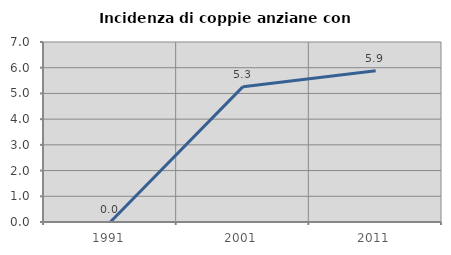
| Category | Incidenza di coppie anziane con figli |
|---|---|
| 1991.0 | 0 |
| 2001.0 | 5.263 |
| 2011.0 | 5.882 |